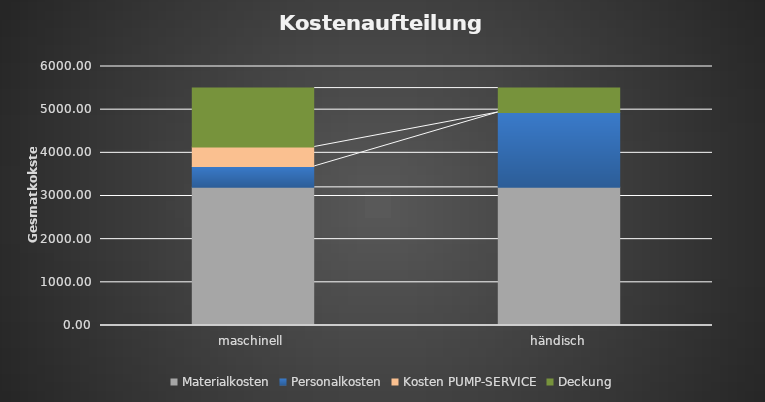
| Category | Materialkosten | Personalkosten | Kosten PUMP-SERVICE | Deckung |
|---|---|---|---|---|
| maschinell | 3200 | 485.333 | 450 | 1364.667 |
| händisch | 3200 | 1735.385 | 0 | 564.615 |